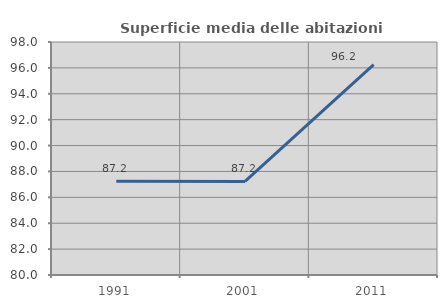
| Category | Superficie media delle abitazioni occupate |
|---|---|
| 1991.0 | 87.243 |
| 2001.0 | 87.233 |
| 2011.0 | 96.246 |